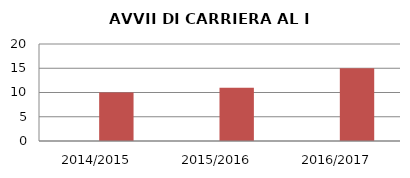
| Category | ANNO | NUMERO |
|---|---|---|
| 2014/2015 | 0 | 10 |
| 2015/2016 | 0 | 11 |
| 2016/2017 | 0 | 15 |